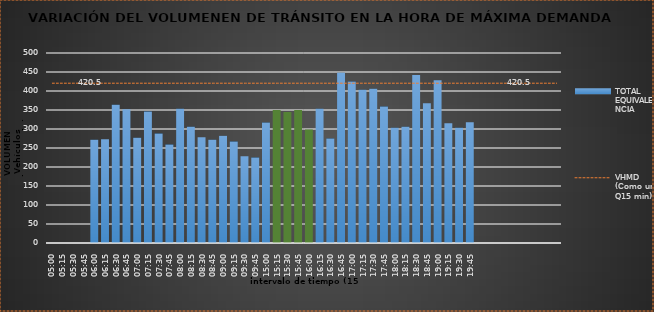
| Category | TOTAL EQUIVALENCIA   |
|---|---|
| 500.0 | 0 |
| 515.0 | 0 |
| 530.0 | 0 |
| 545.0 | 0 |
| 600.0 | 272 |
| 615.0 | 273 |
| 630.0 | 364 |
| 645.0 | 352 |
| 700.0 | 277 |
| 715.0 | 346 |
| 730.0 | 288 |
| 745.0 | 259 |
| 800.0 | 353 |
| 815.0 | 306 |
| 830.0 | 278 |
| 845.0 | 272 |
| 900.0 | 282 |
| 915.0 | 267 |
| 930.0 | 228 |
| 945.0 | 225 |
| 1500.0 | 317 |
| 1515.0 | 350 |
| 1530.0 | 345 |
| 1545.0 | 350 |
| 1600.0 | 299 |
| 1615.0 | 353 |
| 1630.0 | 275 |
| 1645.0 | 448 |
| 1700.0 | 425 |
| 1715.0 | 403 |
| 1730.0 | 406 |
| 1745.0 | 359 |
| 1800.0 | 303 |
| 1815.0 | 306 |
| 1830.0 | 442 |
| 1845.0 | 368 |
| 1900.0 | 428 |
| 1915.0 | 315 |
| 1930.0 | 303 |
| 1945.0 | 318 |